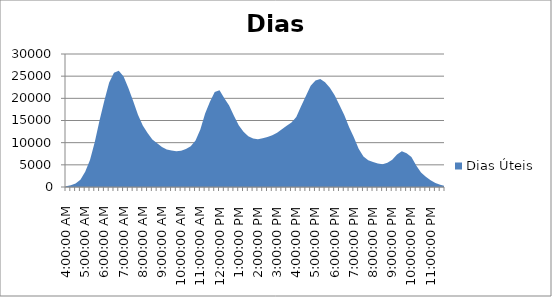
| Category | Dias Úteis |
|---|---|
| 0.16666666666666663 | 151 |
| 0.1770833333333333 | 382 |
| 0.18749999999999994 | 798 |
| 0.1979166666666666 | 1655.4 |
| 0.20833333333333326 | 3466.4 |
| 0.21874999999999992 | 6086.8 |
| 0.22916666666666657 | 10133.8 |
| 0.23958333333333323 | 15059.8 |
| 0.2499999999999999 | 19521.2 |
| 0.2604166666666666 | 23592.6 |
| 0.27083333333333326 | 25797.2 |
| 0.28124999999999994 | 26205.4 |
| 0.29166666666666663 | 24940.4 |
| 0.3020833333333333 | 22333.6 |
| 0.3125 | 19372 |
| 0.3229166666666667 | 16286.4 |
| 0.33333333333333337 | 13900 |
| 0.34375000000000006 | 12173.2 |
| 0.35416666666666674 | 10736 |
| 0.3645833333333334 | 9888.2 |
| 0.3750000000000001 | 9035.4 |
| 0.3854166666666668 | 8451.2 |
| 0.3958333333333335 | 8255.2 |
| 0.40625000000000017 | 8039.8 |
| 0.41666666666666685 | 8167 |
| 0.42708333333333354 | 8597.6 |
| 0.4375000000000002 | 9181 |
| 0.4479166666666669 | 10480 |
| 0.4583333333333336 | 12957.4 |
| 0.4687500000000003 | 16565 |
| 0.47916666666666696 | 19254.2 |
| 0.48958333333333365 | 21412 |
| 0.5000000000000003 | 21846.4 |
| 0.510416666666667 | 20029 |
| 0.5208333333333336 | 18382 |
| 0.5312500000000002 | 16083.4 |
| 0.5416666666666669 | 13954.6 |
| 0.5520833333333335 | 12454.2 |
| 0.5625000000000001 | 11461.2 |
| 0.5729166666666667 | 10916 |
| 0.5833333333333334 | 10776.8 |
| 0.59375 | 10994.4 |
| 0.6041666666666666 | 11285.2 |
| 0.6145833333333333 | 11649.4 |
| 0.6249999999999999 | 12253.8 |
| 0.6354166666666665 | 13022.2 |
| 0.6458333333333331 | 13823.8 |
| 0.6562499999999998 | 14550.2 |
| 0.6666666666666664 | 15805.8 |
| 0.677083333333333 | 18208.4 |
| 0.6874999999999997 | 20539.4 |
| 0.6979166666666663 | 22860.6 |
| 0.7083333333333329 | 24036.4 |
| 0.7187499999999996 | 24349.6 |
| 0.7291666666666662 | 23630.4 |
| 0.7395833333333328 | 22401.6 |
| 0.7499999999999994 | 20692.4 |
| 0.7604166666666661 | 18510.4 |
| 0.7708333333333327 | 16244 |
| 0.7812499999999993 | 13562 |
| 0.791666666666666 | 11197.8 |
| 0.8020833333333326 | 8636.6 |
| 0.8124999999999992 | 6905.8 |
| 0.8229166666666659 | 6048 |
| 0.8333333333333325 | 5615 |
| 0.8437499999999991 | 5274.6 |
| 0.8541666666666657 | 5118.8 |
| 0.8645833333333324 | 5487 |
| 0.874999999999999 | 6147.2 |
| 0.8854166666666656 | 7345 |
| 0.8958333333333323 | 8044 |
| 0.9062499999999989 | 7640.2 |
| 0.9166666666666655 | 6768.6 |
| 0.9270833333333321 | 4833.8 |
| 0.9374999999999988 | 3260.6 |
| 0.9479166666666654 | 2316 |
| 0.958333333333332 | 1524.4 |
| 0.9687499999999987 | 913.8 |
| 0.9791666666666653 | 528.4 |
| 0.9895833333333319 | 204.2 |